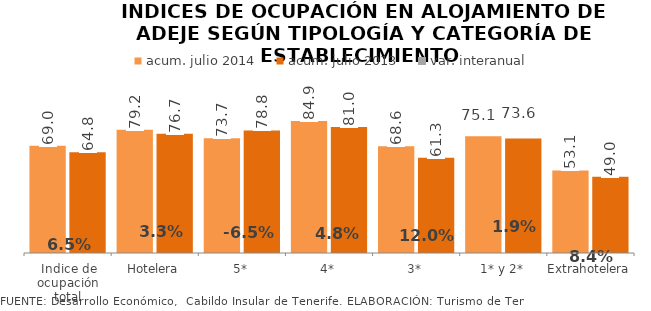
| Category | acum. julio 2014 | acum. julio 2013 |
|---|---|---|
| Indice de ocupación total | 69.009 | 64.791 |
| Hotelera | 79.196 | 76.688 |
| 5* | 73.713 | 78.805 |
| 4* | 84.859 | 81.004 |
| 3* | 68.628 | 61.276 |
| 1* y 2* | 75.055 | 73.627 |
| Extrahotelera | 53.106 | 49 |